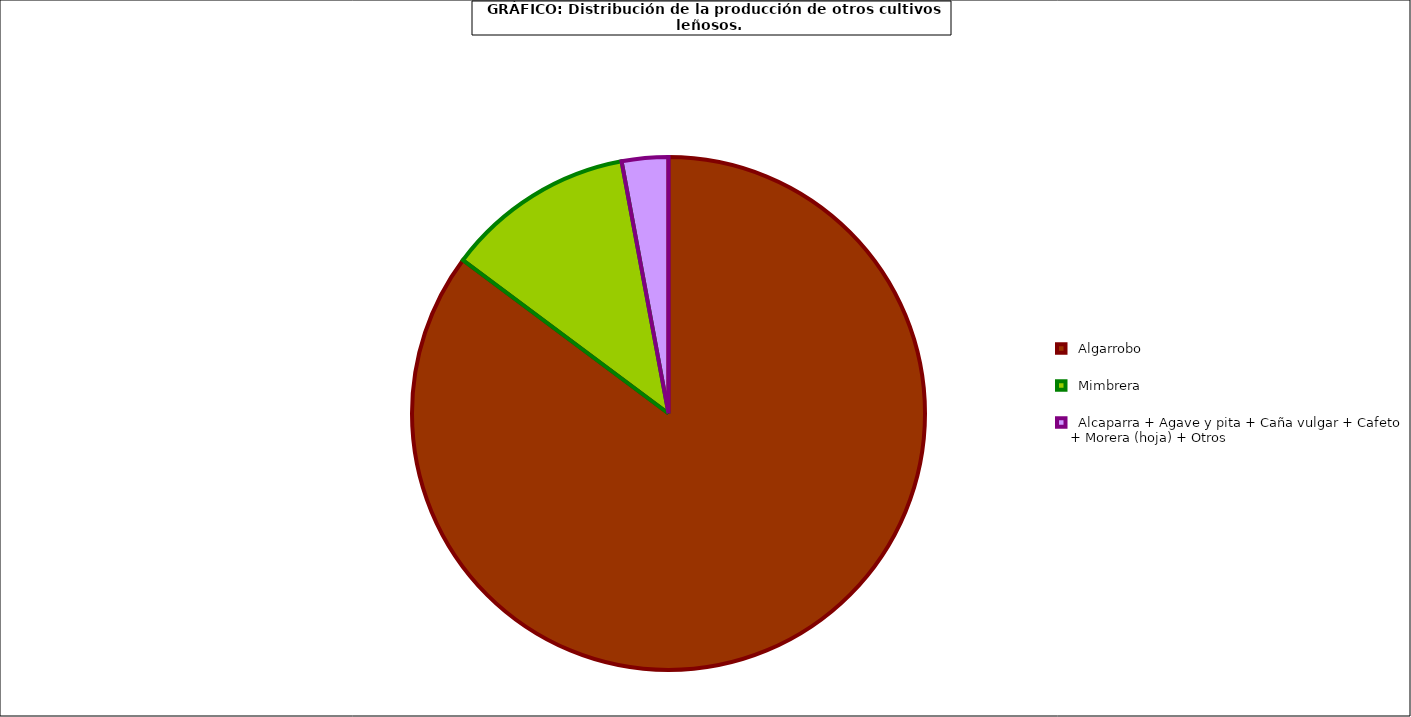
| Category | Series 0 |
|---|---|
|    Algarrobo  | 37246 |
|    Mimbrera  | 5192 |
|    Alcaparra + Agave y pita + Caña vulgar + Cafeto + Morera (hoja) + Otros  | 1280 |